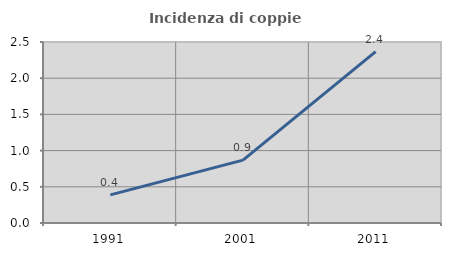
| Category | Incidenza di coppie miste |
|---|---|
| 1991.0 | 0.389 |
| 2001.0 | 0.869 |
| 2011.0 | 2.366 |